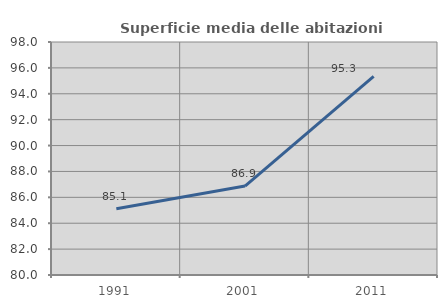
| Category | Superficie media delle abitazioni occupate |
|---|---|
| 1991.0 | 85.122 |
| 2001.0 | 86.869 |
| 2011.0 | 95.344 |